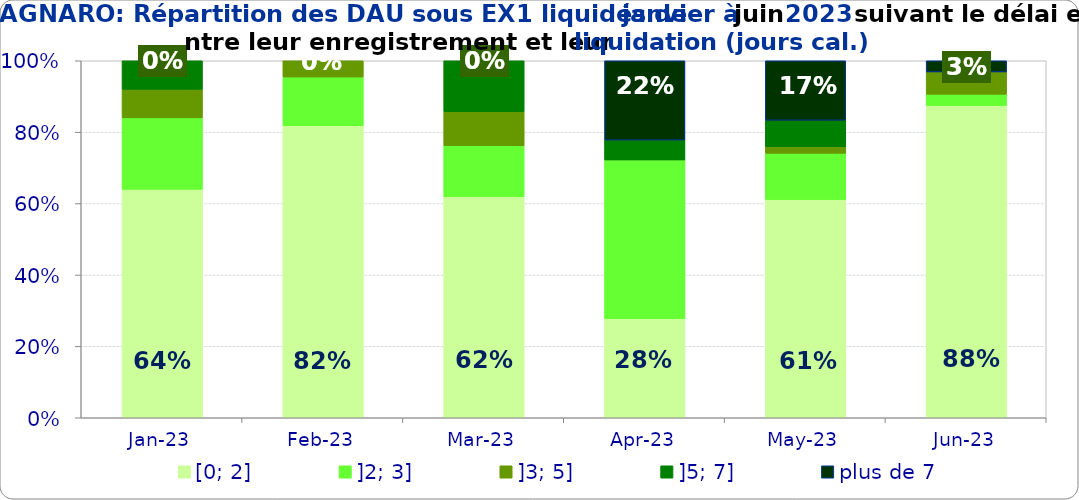
| Category | [0; 2] | ]2; 3] | ]3; 5] | ]5; 7] | plus de 7 |
|---|---|---|---|---|---|
| 2023-01-01 | 0.64 | 0.2 | 0.08 | 0.08 | 0 |
| 2023-02-01 | 0.818 | 0.136 | 0.045 | 0 | 0 |
| 2023-03-01 | 0.619 | 0.143 | 0.095 | 0.143 | 0 |
| 2023-04-01 | 0.278 | 0.444 | 0 | 0.056 | 0.222 |
| 2023-05-01 | 0.611 | 0.13 | 0.019 | 0.074 | 0.167 |
| 2023-06-01 | 0.875 | 0.031 | 0.062 | 0 | 0.031 |